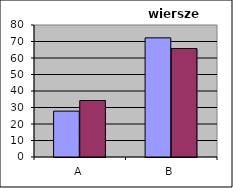
| Category | Series 0 | Series 1 |
|---|---|---|
| A | 27.789 | 34.234 |
| B | 72.211 | 65.766 |